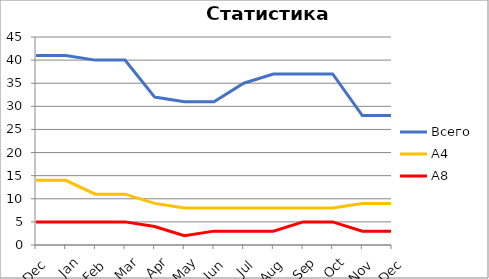
| Category | Всего | А4 | A8 |
|---|---|---|---|
| 0 | 41 | 14 | 5 |
| 1 | 41 | 14 | 5 |
| 2 | 40 | 11 | 5 |
| 3 | 40 | 11 | 5 |
| 4 | 32 | 9 | 4 |
| 5 | 31 | 8 | 2 |
| 6 | 31 | 8 | 3 |
| 7 | 35 | 8 | 3 |
| 8 | 37 | 8 | 3 |
| 9 | 37 | 8 | 5 |
| 10 | 37 | 8 | 5 |
| 11 | 28 | 9 | 3 |
| 12 | 28 | 9 | 3 |